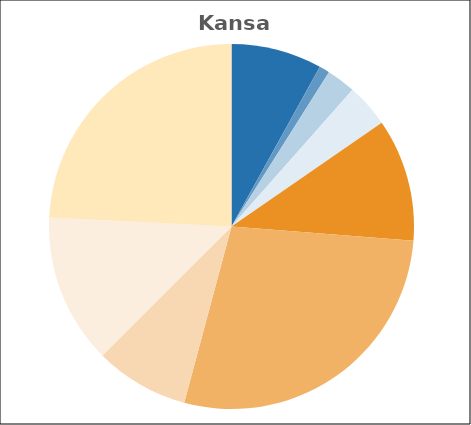
| Category | Series 0 |
|---|---|
| Basic Assistance | 0.08 |
| Work Activities | 0.009 |
| Work Supports and Supportive Services | 0.026 |
| Child Care | 0.039 |
| Administration & Systems | 0.109 |
| Tax Credit | 0.279 |
| Pre-K | 0.083 |
| Child Welfare | 0.133 |
| Other | 0.242 |